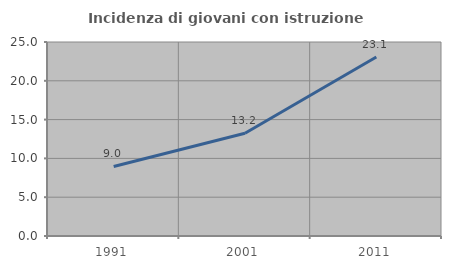
| Category | Incidenza di giovani con istruzione universitaria |
|---|---|
| 1991.0 | 8.963 |
| 2001.0 | 13.235 |
| 2011.0 | 23.064 |